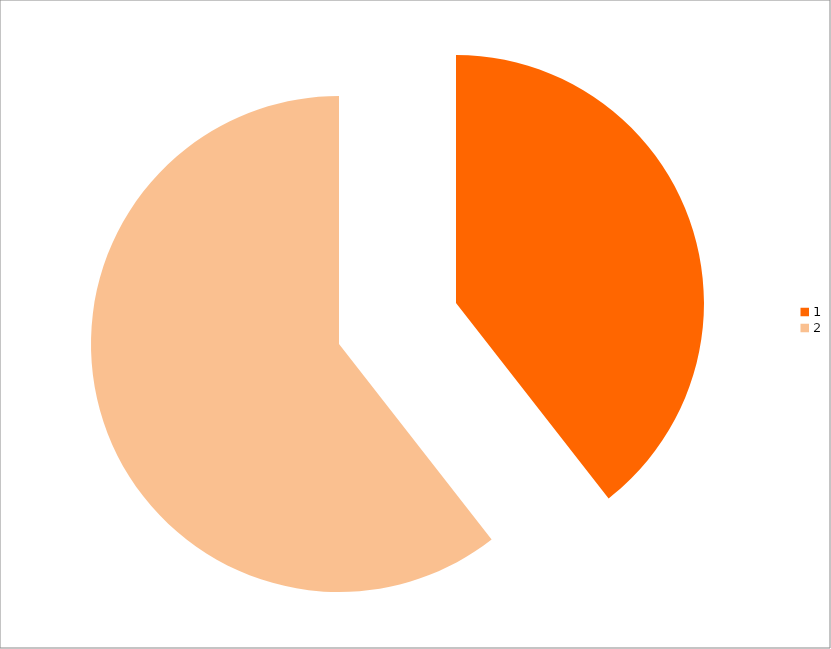
| Category | Series 0 |
|---|---|
| 0 | 43 |
| 1 | 66 |